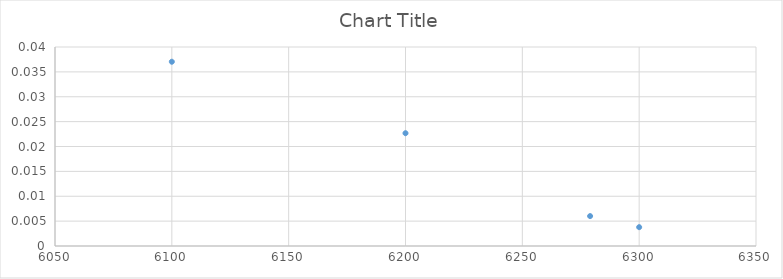
| Category | Series 0 |
|---|---|
| 6100.0 | 0.037 |
| 6200.0 | 0.023 |
| 6300.0 | 0.004 |
| 6279.0 | 0.006 |